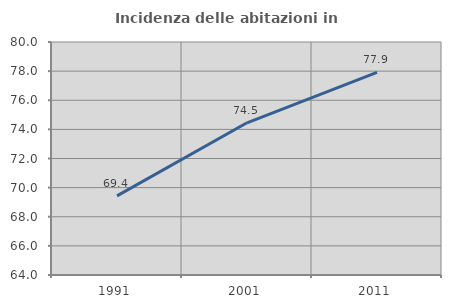
| Category | Incidenza delle abitazioni in proprietà  |
|---|---|
| 1991.0 | 69.436 |
| 2001.0 | 74.452 |
| 2011.0 | 77.911 |